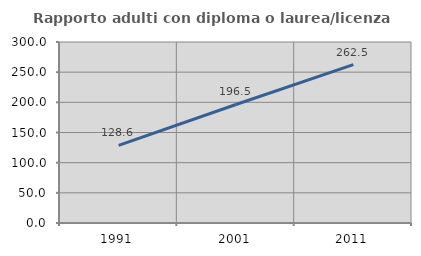
| Category | Rapporto adulti con diploma o laurea/licenza media  |
|---|---|
| 1991.0 | 128.564 |
| 2001.0 | 196.458 |
| 2011.0 | 262.525 |